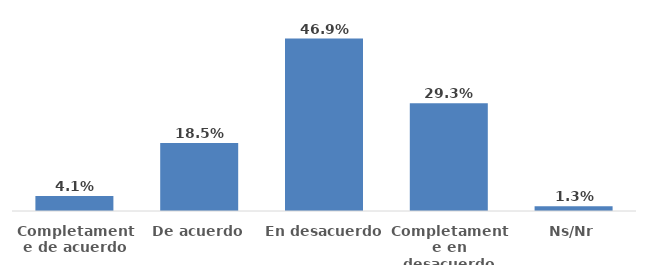
| Category | Series 0 |
|---|---|
| Completamente de acuerdo | 0.041 |
| De acuerdo | 0.185 |
| En desacuerdo | 0.469 |
| Completamente en desacuerdo | 0.293 |
| Ns/Nr | 0.013 |